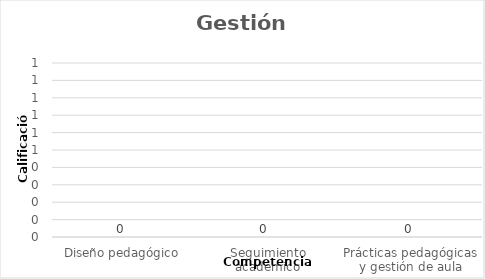
| Category | Series 0 |
|---|---|
| Diseño pedagógico | 0 |
| Seguimiento académico | 0 |
| Prácticas pedagógicas y gestión de aula | 0 |